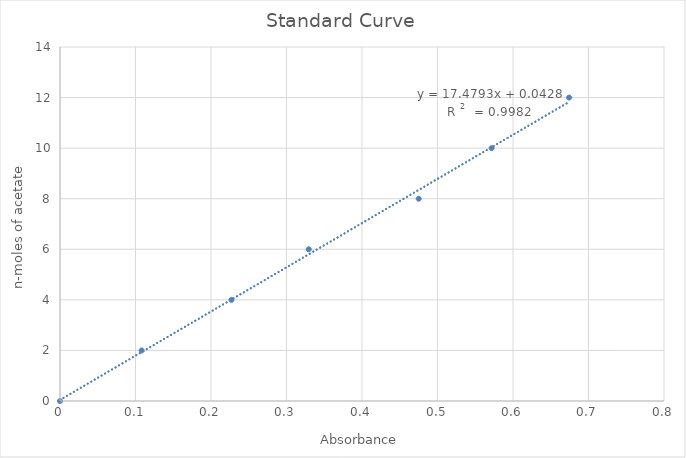
| Category | Series 0 |
|---|---|
| 0.0 | 0 |
| 0.10809999999999997 | 2 |
| 0.22704999999999997 | 4 |
| 0.32945 | 6 |
| 0.4751000000000001 | 8 |
| 0.5717 | 10 |
| 0.6742999999999999 | 12 |